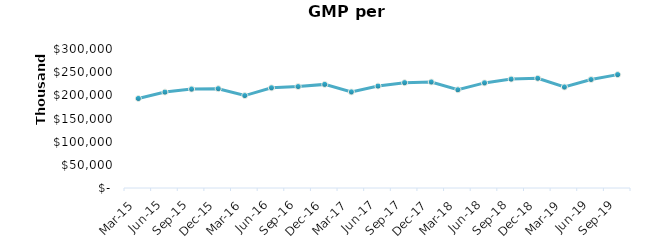
| Category | Total |
|---|---|
| Mar-15 | 193214760.65 |
| Jun-15 | 206971890.35 |
| Sep-15 | 213490881.83 |
| Dec-15 | 214349105.84 |
| Mar-16 | 199493745.37 |
| Jun-16 | 216148419.22 |
| Sep-16 | 218976889.8 |
| Dec-16 | 223617895.79 |
| Mar-17 | 207333812.45 |
| Jun-17 | 219981727.55 |
| Sep-17 | 227293496.76 |
| Dec-17 | 228775828.16 |
| Mar-18 | 212038702.39 |
| Jun-18 | 226827967.75 |
| Sep-18 | 235037993.57 |
| Dec-18 | 236774885.37 |
| Mar-19 | 217929233.04 |
| Jun-19 | 234134611.36 |
| Sep-19 | 244715476.07 |